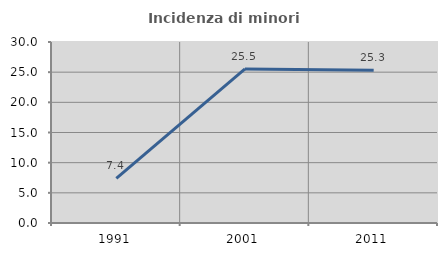
| Category | Incidenza di minori stranieri |
|---|---|
| 1991.0 | 7.407 |
| 2001.0 | 25.532 |
| 2011.0 | 25.322 |